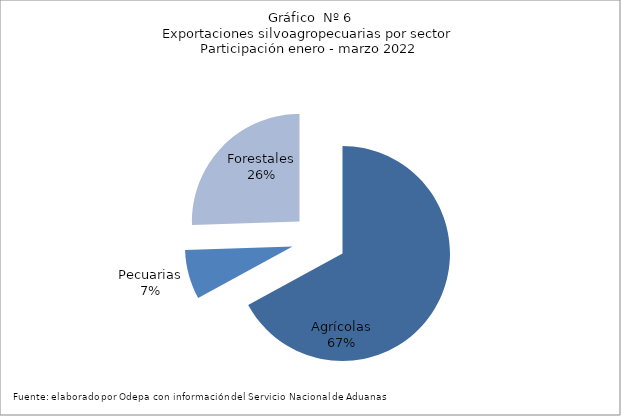
| Category | Series 0 |
|---|---|
| Agrícolas | 3799153 |
| Pecuarias | 422577 |
| Forestales | 1445262 |